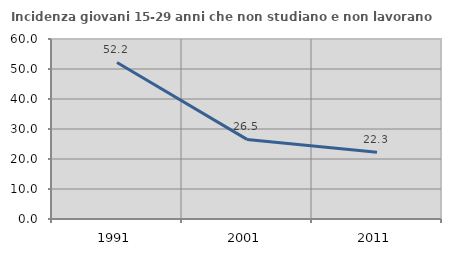
| Category | Incidenza giovani 15-29 anni che non studiano e non lavorano  |
|---|---|
| 1991.0 | 52.174 |
| 2001.0 | 26.538 |
| 2011.0 | 22.286 |